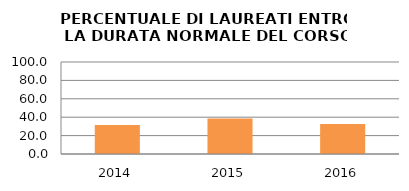
| Category | 2014 2015 2016 |
|---|---|
| 2014.0 | 31.473 |
| 2015.0 | 38.664 |
| 2016.0 | 32.505 |